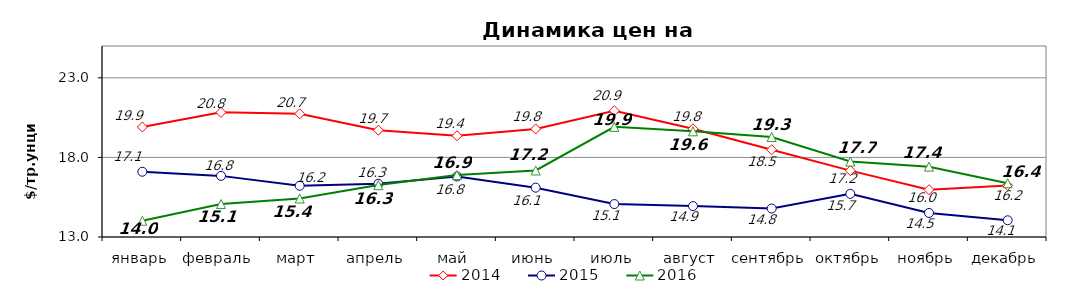
| Category | 2014 | 2015 | 2016 |
|---|---|---|---|
| январь | 19.91 | 17.1 | 14.02 |
| февраль | 20.83 | 16.84 | 15.07 |
| март | 20.74 | 16.22 | 15.42 |
| апрель | 19.71 | 16.34 | 16.26 |
| май | 19.36 | 16.8 | 16.89 |
| июнь | 19.79 | 16.1 | 17.18 |
| июль | 20.93 | 15.07 | 19.92 |
| август | 19.8 | 14.94 | 19.64 |
| сентябрь | 18.48 | 14.79 | 19.28 |
| октябрь | 17.17 | 15.71 | 17.74 |
| ноябрь | 15.97 | 14.51 | 17.42 |
| декабрь | 16.24 | 14.05 | 16.38 |